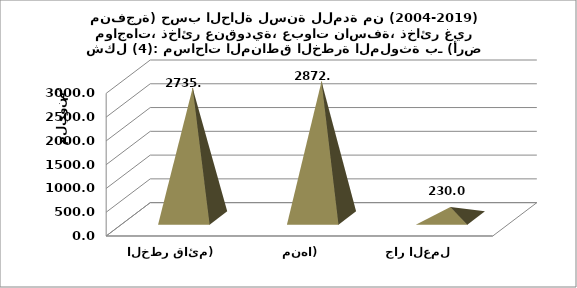
| Category | Series 0 |
|---|---|
| مفتوح (لازال الخطر قائم) | 2735.675 |
| مغلق (رفع الخطر منها) | 2872.311 |
|  جار العمل      | 230.04 |